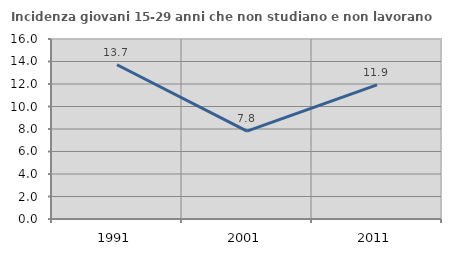
| Category | Incidenza giovani 15-29 anni che non studiano e non lavorano  |
|---|---|
| 1991.0 | 13.71 |
| 2001.0 | 7.812 |
| 2011.0 | 11.917 |